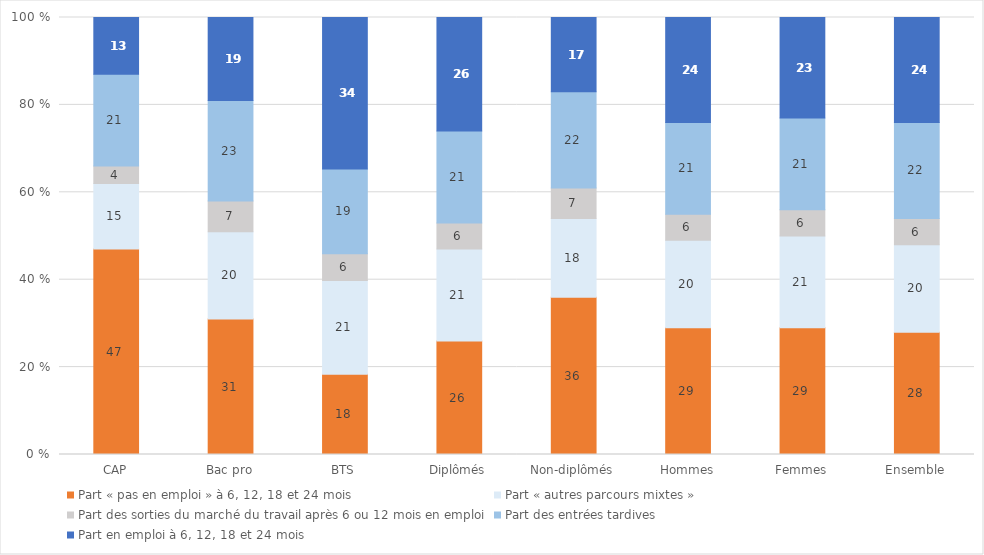
| Category | Part « pas en emploi » à 6, 12, 18 et 24 mois | Part « autres parcours mixtes » | Part des sorties du marché du travail après 6 ou 12 mois en emploi | Part des entrées tardives | Part en emploi à 6, 12, 18 et 24 mois |
|---|---|---|---|---|---|
| CAP | 47 | 15 | 4 | 21 | 13 |
| Bac pro | 31 | 20 | 7 | 23 | 19 |
| BTS | 18 | 21 | 6 | 19 | 34 |
| Diplômés | 26 | 21 | 6 | 21 | 26 |
| Non-diplômés | 36 | 18 | 7 | 22 | 17 |
| Hommes | 29 | 20 | 6 | 21 | 24 |
| Femmes | 29 | 21 | 6 | 21 | 23 |
| Ensemble | 28 | 20 | 6 | 22 | 24 |